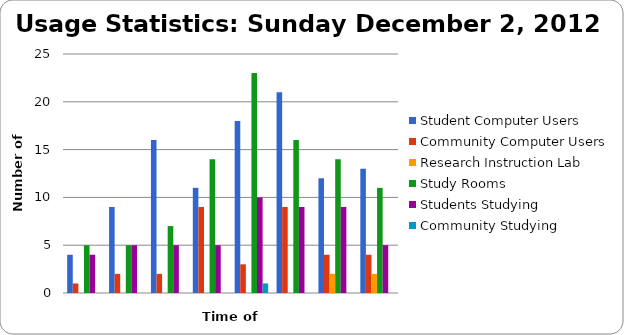
| Category | Student Computer Users | Community Computer Users | Research Instruction Lab | Study Rooms | Students Studying | Community Studying |
|---|---|---|---|---|---|---|
| 10 am | 4 | 1 | 0 | 5 | 4 | 0 |
| 11 am | 9 | 2 | 0 | 5 | 5 | 0 |
| 12 pm | 16 | 2 | 0 | 7 | 5 | 0 |
| 1 pm | 11 | 9 | 0 | 14 | 5 | 0 |
| 2 pm | 18 | 3 | 0 | 23 | 10 | 1 |
| 3 pm | 21 | 9 | 0 | 16 | 9 | 0 |
| 4 pm | 12 | 4 | 2 | 14 | 9 | 0 |
| 5 pm | 13 | 4 | 2 | 11 | 5 | 0 |